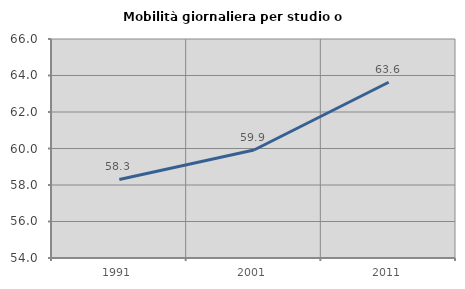
| Category | Mobilità giornaliera per studio o lavoro |
|---|---|
| 1991.0 | 58.306 |
| 2001.0 | 59.916 |
| 2011.0 | 63.63 |